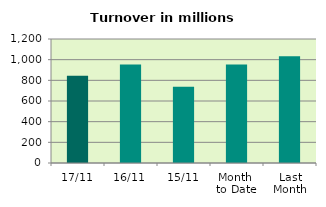
| Category | Series 0 |
|---|---|
| 17/11 | 845.078 |
| 16/11 | 954.041 |
| 15/11 | 737.087 |
| Month 
to Date | 954.327 |
| Last
Month | 1032.218 |